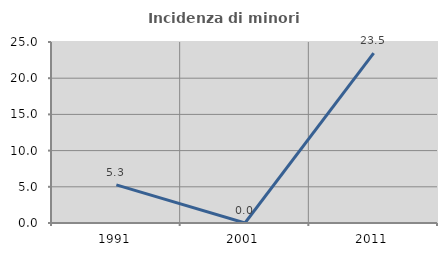
| Category | Incidenza di minori stranieri |
|---|---|
| 1991.0 | 5.263 |
| 2001.0 | 0 |
| 2011.0 | 23.469 |